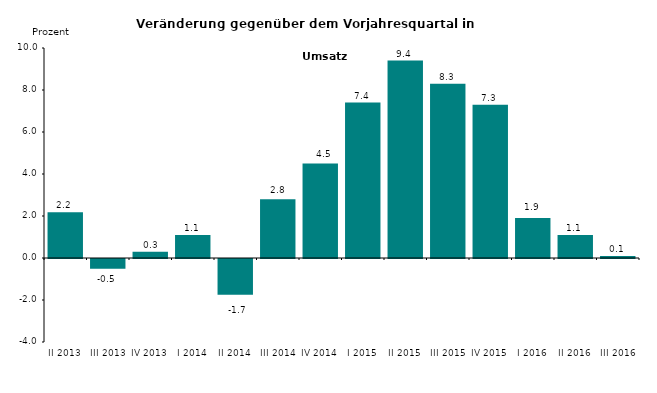
| Category | Series 0 |
|---|---|
| II 2013 | 2.181 |
| III 2013 | -0.465 |
| IV 2013 | 0.3 |
| I 2014 | 1.1 |
| II 2014 | -1.7 |
| III 2014 | 2.8 |
| IV 2014 | 4.5 |
| I 2015 | 7.4 |
| II 2015 | 9.4 |
| III 2015 | 8.3 |
| IV 2015 | 7.3 |
| I 2016 | 1.9 |
| II 2016 | 1.1 |
| III 2016 | 0.1 |